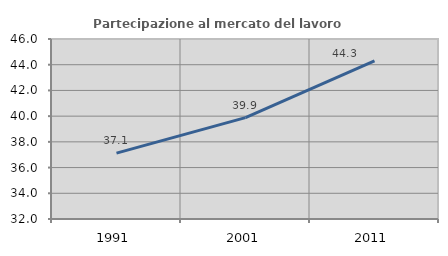
| Category | Partecipazione al mercato del lavoro  femminile |
|---|---|
| 1991.0 | 37.124 |
| 2001.0 | 39.888 |
| 2011.0 | 44.301 |